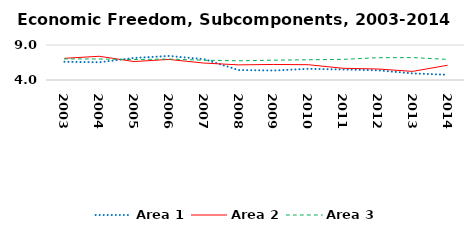
| Category | Area 1 | Area 2 | Area 3 |
|---|---|---|---|
| 2003.0 | 6.606 | 7.098 | 7.013 |
| 2004.0 | 6.531 | 7.39 | 7 |
| 2005.0 | 7.152 | 6.637 | 6.922 |
| 2006.0 | 7.435 | 6.938 | 6.993 |
| 2007.0 | 6.984 | 6.42 | 6.832 |
| 2008.0 | 5.421 | 6.161 | 6.746 |
| 2009.0 | 5.357 | 6.219 | 6.83 |
| 2010.0 | 5.595 | 6.184 | 6.891 |
| 2011.0 | 5.504 | 5.675 | 6.951 |
| 2012.0 | 5.384 | 5.571 | 7.183 |
| 2013.0 | 4.94 | 5.232 | 7.202 |
| 2014.0 | 4.747 | 6.107 | 6.948 |